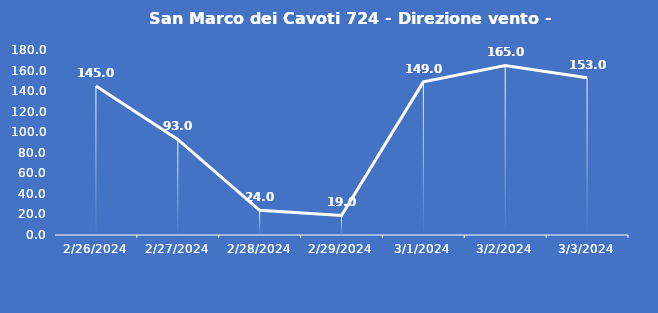
| Category | San Marco dei Cavoti 724 - Direzione vento - Grezzo (°N) |
|---|---|
| 2/26/24 | 145 |
| 2/27/24 | 93 |
| 2/28/24 | 24 |
| 2/29/24 | 19 |
| 3/1/24 | 149 |
| 3/2/24 | 165 |
| 3/3/24 | 153 |